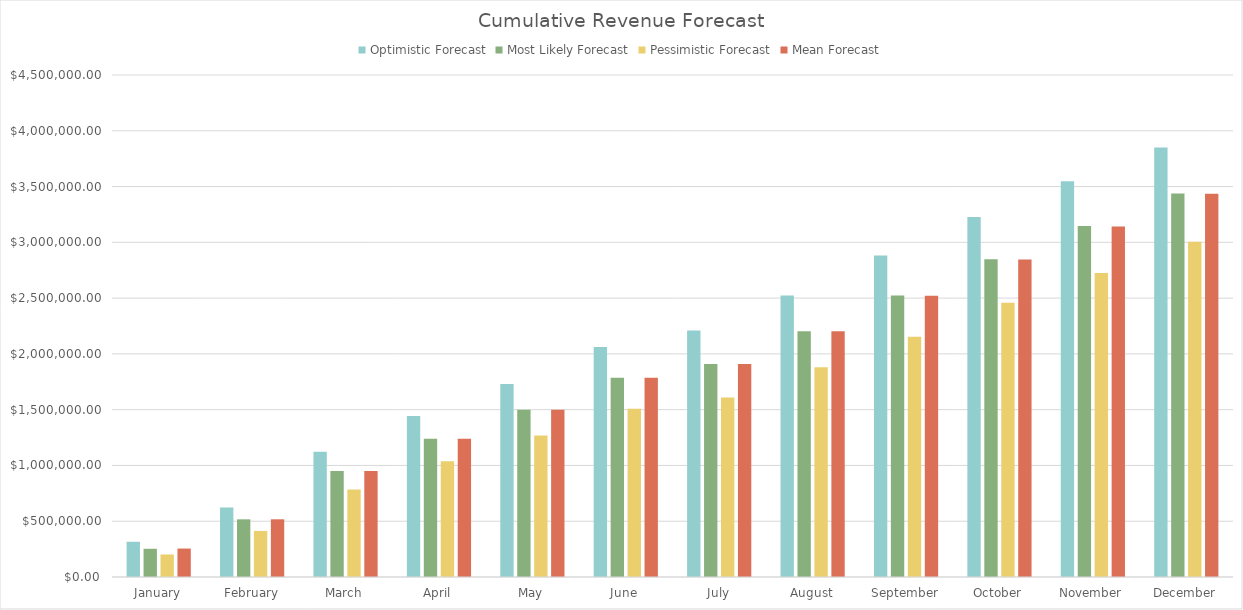
| Category | Optimistic Forecast | Most Likely Forecast | Pessimistic Forecast | Mean Forecast |
|---|---|---|---|---|
| January | 316000 | 253000 | 202000 | 255000 |
| February | 623200 | 517000 | 413000 | 517366.667 |
| March | 1122700 | 950000 | 784000 | 951116.667 |
| April | 1443200 | 1240000 | 1037000 | 1240033.333 |
| May | 1731200 | 1500000 | 1269000 | 1500033.333 |
| June | 2061200 | 1785000 | 1509000 | 1785033.333 |
| July | 2210200 | 1910000 | 1610000 | 1910033.333 |
| August | 2523200 | 2202000 | 1880000 | 2201866.667 |
| September | 2881100 | 2523000 | 2154000 | 2521183.333 |
| October | 3226800 | 2847500 | 2457900 | 2845783.333 |
| November | 3547050 | 3146000 | 2726100 | 3142858.333 |
| December | 3849050 | 3438400 | 3004600 | 3434541.667 |